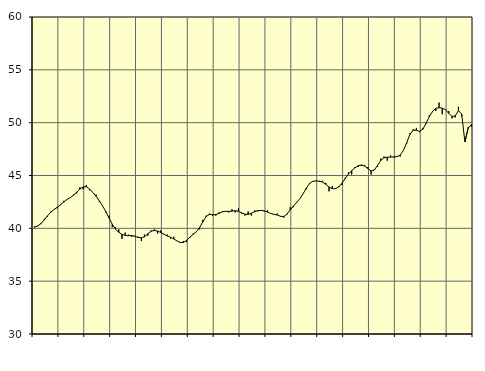
| Category | Piggar | Samtliga fast anställda (inkl. fast anställda utomlands) |
|---|---|---|
| nan | 40.2 | 40.09 |
| 87.0 | 40.2 | 40.24 |
| 87.0 | 40.4 | 40.46 |
| 87.0 | 40.9 | 40.79 |
| nan | 41.1 | 41.19 |
| 88.0 | 41.6 | 41.53 |
| 88.0 | 41.8 | 41.78 |
| 88.0 | 41.9 | 41.99 |
| nan | 42.2 | 42.23 |
| 89.0 | 42.6 | 42.49 |
| 89.0 | 42.7 | 42.73 |
| 89.0 | 42.9 | 42.9 |
| nan | 43.2 | 43.13 |
| 90.0 | 43.3 | 43.42 |
| 90.0 | 43.9 | 43.71 |
| 90.0 | 43.7 | 43.92 |
| nan | 44.1 | 43.93 |
| 91.0 | 43.6 | 43.72 |
| 91.0 | 43.4 | 43.39 |
| 91.0 | 43.2 | 43.02 |
| nan | 42.5 | 42.6 |
| 92.0 | 42.1 | 42.12 |
| 92.0 | 41.5 | 41.59 |
| 92.0 | 41.2 | 40.98 |
| nan | 40.1 | 40.39 |
| 93.0 | 40.1 | 39.93 |
| 93.0 | 39.9 | 39.62 |
| 93.0 | 39 | 39.43 |
| nan | 39.6 | 39.32 |
| 94.0 | 39.4 | 39.3 |
| 94.0 | 39.2 | 39.31 |
| 94.0 | 39.3 | 39.25 |
| nan | 39.2 | 39.14 |
| 95.0 | 38.8 | 39.1 |
| 95.0 | 39.4 | 39.21 |
| 95.0 | 39.3 | 39.49 |
| nan | 39.8 | 39.73 |
| 96.0 | 39.9 | 39.8 |
| 96.0 | 39.5 | 39.74 |
| 96.0 | 39.8 | 39.6 |
| nan | 39.4 | 39.45 |
| 97.0 | 39.4 | 39.28 |
| 97.0 | 39 | 39.15 |
| 97.0 | 39.2 | 39 |
| nan | 38.8 | 38.81 |
| 98.0 | 38.7 | 38.65 |
| 98.0 | 38.8 | 38.67 |
| 98.0 | 38.7 | 38.87 |
| nan | 39.1 | 39.16 |
| 99.0 | 39.5 | 39.43 |
| 99.0 | 39.7 | 39.68 |
| 99.0 | 39.9 | 40.08 |
| nan | 40.8 | 40.62 |
| 0.0 | 41.2 | 41.11 |
| 0.0 | 41.4 | 41.31 |
| 0.0 | 41.2 | 41.29 |
| nan | 41.2 | 41.3 |
| 1.0 | 41.5 | 41.42 |
| 1.0 | 41.6 | 41.57 |
| 1.0 | 41.6 | 41.61 |
| nan | 41.5 | 41.6 |
| 2.0 | 41.8 | 41.63 |
| 2.0 | 41.5 | 41.67 |
| 2.0 | 41.9 | 41.61 |
| nan | 41.4 | 41.47 |
| 3.0 | 41.2 | 41.34 |
| 3.0 | 41.6 | 41.31 |
| 3.0 | 41.2 | 41.43 |
| nan | 41.7 | 41.58 |
| 4.0 | 41.6 | 41.68 |
| 4.0 | 41.7 | 41.7 |
| 4.0 | 41.6 | 41.65 |
| nan | 41.7 | 41.54 |
| 5.0 | 41.4 | 41.4 |
| 5.0 | 41.3 | 41.32 |
| 5.0 | 41.4 | 41.26 |
| nan | 41.1 | 41.14 |
| 6.0 | 41 | 41.12 |
| 6.0 | 41.3 | 41.35 |
| 6.0 | 42 | 41.74 |
| nan | 42 | 42.12 |
| 7.0 | 42.5 | 42.45 |
| 7.0 | 42.8 | 42.81 |
| 7.0 | 43.3 | 43.28 |
| nan | 43.7 | 43.81 |
| 8.0 | 44.3 | 44.25 |
| 8.0 | 44.4 | 44.46 |
| 8.0 | 44.5 | 44.48 |
| nan | 44.4 | 44.47 |
| 9.0 | 44.5 | 44.38 |
| 9.0 | 44.3 | 44.17 |
| 9.0 | 43.5 | 43.91 |
| nan | 44 | 43.75 |
| 10.0 | 43.8 | 43.76 |
| 10.0 | 44 | 43.91 |
| 10.0 | 44.1 | 44.27 |
| nan | 44.8 | 44.72 |
| 11.0 | 45.3 | 45.13 |
| 11.0 | 45.1 | 45.46 |
| 11.0 | 45.8 | 45.72 |
| nan | 45.8 | 45.92 |
| 12.0 | 45.9 | 46 |
| 12.0 | 46 | 45.89 |
| 12.0 | 45.8 | 45.65 |
| nan | 45.1 | 45.43 |
| 13.0 | 45.6 | 45.52 |
| 13.0 | 45.8 | 45.96 |
| 13.0 | 46.6 | 46.43 |
| nan | 46.8 | 46.68 |
| 14.0 | 46.4 | 46.73 |
| 14.0 | 46.9 | 46.74 |
| 14.0 | 46.7 | 46.76 |
| nan | 46.8 | 46.78 |
| 15.0 | 46.8 | 46.93 |
| 15.0 | 47.4 | 47.38 |
| 15.0 | 48 | 48.1 |
| nan | 49 | 48.89 |
| 16.0 | 49.4 | 49.29 |
| 16.0 | 49.5 | 49.28 |
| 16.0 | 49.1 | 49.18 |
| nan | 49.5 | 49.38 |
| 17.0 | 49.9 | 49.95 |
| 17.0 | 50.7 | 50.58 |
| 17.0 | 51 | 51.07 |
| nan | 51.1 | 51.35 |
| 18.0 | 51.9 | 51.42 |
| 18.0 | 50.8 | 51.37 |
| 18.0 | 51.2 | 51.22 |
| nan | 51.1 | 50.88 |
| 19.0 | 50.4 | 50.58 |
| 19.0 | 50.5 | 50.64 |
| 19.0 | 51.5 | 51.14 |
| nan | 50.6 | 50.81 |
| 20.0 | 48.2 | 48.18 |
| 20.0 | 49.6 | 49.48 |
| 20.0 | 49.6 | 49.82 |